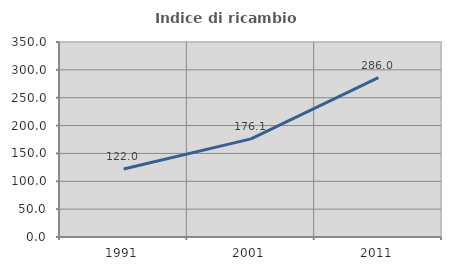
| Category | Indice di ricambio occupazionale  |
|---|---|
| 1991.0 | 121.981 |
| 2001.0 | 176.099 |
| 2011.0 | 285.993 |